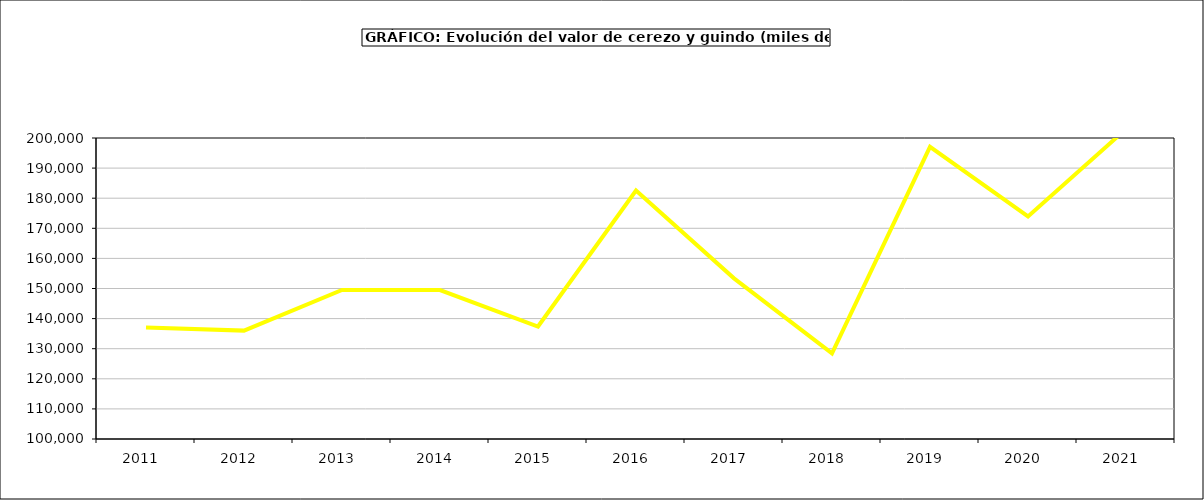
| Category | valor cerezo y guindo |
|---|---|
| 2011.0 | 137034.469 |
| 2012.0 | 136005.543 |
| 2013.0 | 149538.377 |
| 2014.0 | 149493.495 |
| 2015.0 | 137364 |
| 2016.0 | 182544 |
| 2017.0 | 153374.55 |
| 2018.0 | 128453.5 |
| 2019.0 | 197061.787 |
| 2020.0 | 173932.727 |
| 2021.0 | 202968.339 |